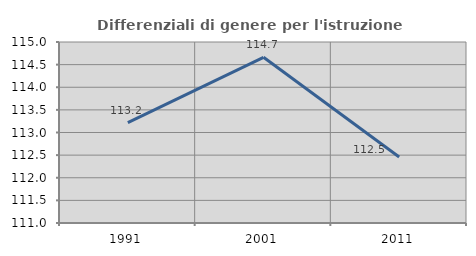
| Category | Differenziali di genere per l'istruzione superiore |
|---|---|
| 1991.0 | 113.22 |
| 2001.0 | 114.662 |
| 2011.0 | 112.459 |